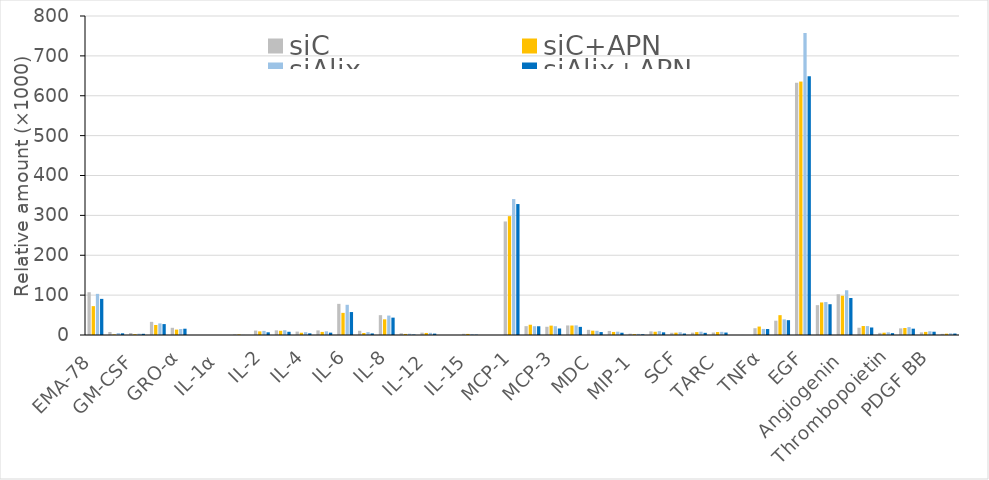
| Category | siC | siC+APN | siAlix | siAlix+APN |
|---|---|---|---|---|
| EMA-78 | 107.258 | 72.388 | 103.136 | 90.596 |
| GCSF | 7.611 | 1.508 | 4.894 | 4.26 |
| GM-CSF | 5.036 | 1.992 | 3.286 | 3.02 |
| GRO | 32.972 | 25.139 | 29.062 | 27.362 |
| GRO-α | 18.052 | 13.573 | 14.928 | 15.758 |
| I-309 | 0 | 0 | 0 | 0 |
| IL-1α | 0 | 0 | 0 | 0 |
| IL-1β | 1.492 | 1.338 | 0.284 | 0 |
| IL-2 | 11.106 | 9.088 | 10.325 | 6.766 |
| IL-3 | 11.689 | 10.546 | 11.986 | 8.068 |
| IL-4 | 8.533 | 5.67 | 7.086 | 4.206 |
| IL-5 | 11.564 | 7.725 | 9.252 | 5.898 |
| IL-6 | 78.099 | 55.516 | 75.742 | 57.551 |
| IL-7 | 10.558 | 5.013 | 7.159 | 3.97 |
| IL-8 | 49.774 | 39.288 | 48.737 | 43.558 |
| IL-10 | 4.401 | 2.661 | 3.196 | 1.028 |
| IL-12 | 5.866 | 5.158 | 5.424 | 3.482 |
| IL-13 | 0 | 0 | 0 | 0 |
| IL-15 | 2.956 | 2.728 | 2.342 | 0.719 |
| IFNγ | 0 | 0 | 0 | 0 |
| MCP-1 | 284.702 | 298.014 | 340.946 | 328.418 |
| MCP-2 | 22.22 | 25.732 | 22.024 | 21.93 |
| MCP-3 | 20.658 | 23.528 | 22.042 | 16.326 |
| MCSF | 23.958 | 23.758 | 24.136 | 20.378 |
| MDC | 12.936 | 10.866 | 10.582 | 7.348 |
| MIG | 10.144 | 7.665 | 8.324 | 5.684 |
| MIP-1 | 3.266 | 2.092 | 2.717 | 1.662 |
| RANTES | 9.145 | 8.13 | 9.622 | 6.708 |
| SCF | 5.573 | 5.864 | 6.797 | 3.703 |
| SDF-1 | 5.864 | 7.256 | 8.242 | 5.428 |
| TARC | 6.216 | 7.451 | 7.852 | 6.144 |
| TGFβ1 | 0 | 0 | 0.11 | 0 |
| TNFα | 17.082 | 21.147 | 15.23 | 14.966 |
| TNFβ | 35.864 | 49.758 | 39.287 | 37.16 |
| EGF | 632.844 | 635.593 | 757.454 | 648.628 |
| IGF-1 | 74.866 | 81.631 | 82.624 | 77.218 |
| Angiogenin | 102.21 | 98.452 | 112.176 | 92.778 |
| Oncostatin M | 18.206 | 22.494 | 22.356 | 18.836 |
| Thrombopoietin | 5.337 | 5.743 | 6.725 | 4.672 |
| VEGF | 16.635 | 17.563 | 19.778 | 15.86 |
| PDGF BB | 6.568 | 7.764 | 9.35 | 8.222 |
| Leptin | 2.851 | 3.322 | 4.218 | 3.692 |